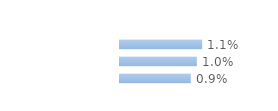
| Category | Series 0 |
|---|---|
| Immigrées | 0.011 |
| Descendantes d'immigré(s) | 0.01 |
| Ni immigrées, ni descendantes | 0.009 |